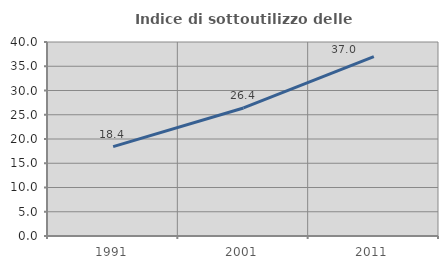
| Category | Indice di sottoutilizzo delle abitazioni  |
|---|---|
| 1991.0 | 18.44 |
| 2001.0 | 26.398 |
| 2011.0 | 36.986 |